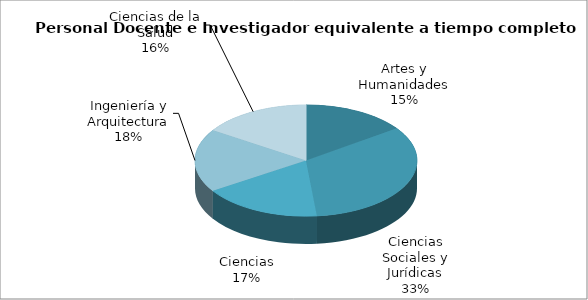
| Category | Series 0 |
|---|---|
| Artes y Humanidades | 307.625 |
| Ciencias Sociales y Jurídicas | 675.25 |
| Ciencias | 353 |
| Ingeniería y Arquitectura | 372.75 |
| Ciencias de la Salud | 320.5 |